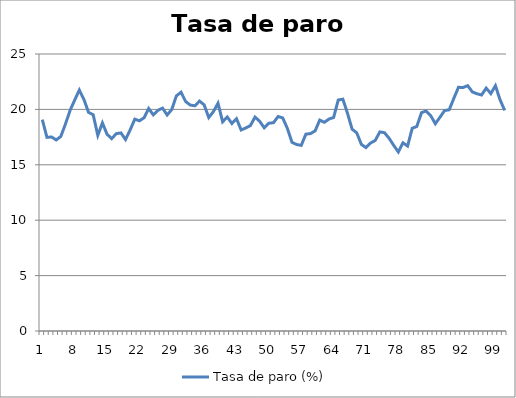
| Category | Tasa de paro (%) |
|---|---|
| 0 | 19.075 |
| 1 | 17.479 |
| 2 | 17.512 |
| 3 | 17.241 |
| 4 | 17.558 |
| 5 | 18.67 |
| 6 | 19.904 |
| 7 | 20.841 |
| 8 | 21.744 |
| 9 | 20.902 |
| 10 | 19.729 |
| 11 | 19.519 |
| 12 | 17.659 |
| 13 | 18.78 |
| 14 | 17.761 |
| 15 | 17.357 |
| 16 | 17.812 |
| 17 | 17.878 |
| 18 | 17.281 |
| 19 | 18.15 |
| 20 | 19.118 |
| 21 | 18.971 |
| 22 | 19.241 |
| 23 | 20.084 |
| 24 | 19.509 |
| 25 | 19.917 |
| 26 | 20.114 |
| 27 | 19.495 |
| 28 | 19.992 |
| 29 | 21.224 |
| 30 | 21.548 |
| 31 | 20.708 |
| 32 | 20.392 |
| 33 | 20.327 |
| 34 | 20.75 |
| 35 | 20.409 |
| 36 | 19.263 |
| 37 | 19.799 |
| 38 | 20.555 |
| 39 | 18.881 |
| 40 | 19.317 |
| 41 | 18.726 |
| 42 | 19.157 |
| 43 | 18.144 |
| 44 | 18.326 |
| 45 | 18.539 |
| 46 | 19.305 |
| 47 | 18.932 |
| 48 | 18.333 |
| 49 | 18.752 |
| 50 | 18.8 |
| 51 | 19.36 |
| 52 | 19.226 |
| 53 | 18.286 |
| 54 | 17.029 |
| 55 | 16.831 |
| 56 | 16.751 |
| 57 | 17.77 |
| 58 | 17.813 |
| 59 | 18.063 |
| 60 | 19.035 |
| 61 | 18.837 |
| 62 | 19.128 |
| 63 | 19.266 |
| 64 | 20.848 |
| 65 | 20.922 |
| 66 | 19.656 |
| 67 | 18.218 |
| 68 | 17.887 |
| 69 | 16.843 |
| 70 | 16.55 |
| 71 | 16.969 |
| 72 | 17.193 |
| 73 | 17.969 |
| 74 | 17.895 |
| 75 | 17.396 |
| 76 | 16.75 |
| 77 | 16.159 |
| 78 | 16.985 |
| 79 | 16.689 |
| 80 | 18.295 |
| 81 | 18.461 |
| 82 | 19.703 |
| 83 | 19.857 |
| 84 | 19.435 |
| 85 | 18.706 |
| 86 | 19.289 |
| 87 | 19.892 |
| 88 | 19.968 |
| 89 | 20.993 |
| 90 | 21.993 |
| 91 | 21.978 |
| 92 | 22.141 |
| 93 | 21.58 |
| 94 | 21.413 |
| 95 | 21.3 |
| 96 | 21.92 |
| 97 | 21.428 |
| 98 | 22.138 |
| 99 | 20.865 |
| 100 | 19.909 |